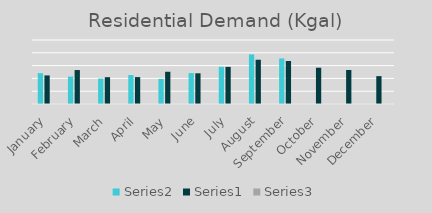
| Category | Series 1 | Series 0 | Series 2 |
|---|---|---|---|
| January | 48220 | 44639 | 1.08 |
| February | 42842.474 | 53057 | 0.807 |
| March | 39765.159 | 41882 | 0.949 |
| April | 45340.468 | 42057.867 | 1.078 |
| May | 39237.233 | 50377.601 | 0.779 |
| June | 48324.105 | 47943.133 | 1.008 |
| July | 58007.249 | 58007.249 | 1 |
| August | 77500.177 | 69155.328 | 1.121 |
| September | 71140.599 | 67226.815 | 1.058 |
| October | 0 | 56697.11 | 0 |
| November | 0 | 53097.198 | 0 |
| December | 0 | 43519.04 | 0 |